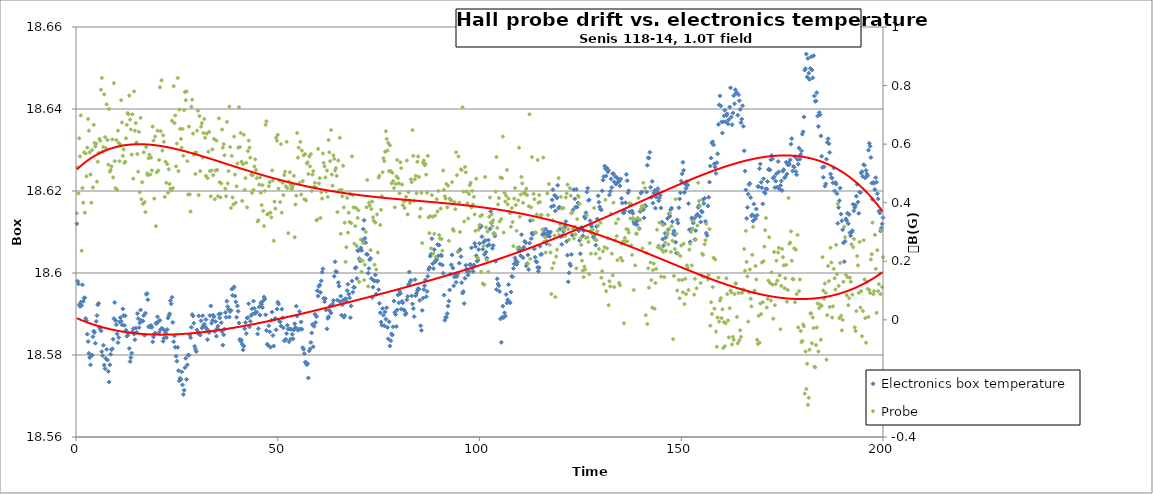
| Category | Electronics box temperature |
|---|---|
| 0.2 | 18.612 |
| 0.4 | 18.598 |
| 0.6000000000000001 | 18.597 |
| 0.8 | 18.592 |
| 1.0 | 18.592 |
| 1.2 | 18.593 |
| 1.4 | 18.592 |
| 1.5999999999999999 | 18.597 |
| 1.7999999999999998 | 18.593 |
| 1.9999999999999998 | 18.594 |
| 2.1999999999999997 | 18.594 |
| 2.4 | 18.589 |
| 2.6 | 18.588 |
| 2.8000000000000003 | 18.585 |
| 3.0000000000000004 | 18.583 |
| 3.2000000000000006 | 18.58 |
| 3.400000000000001 | 18.579 |
| 3.600000000000001 | 18.578 |
| 3.800000000000001 | 18.58 |
| 4.000000000000001 | 18.58 |
| 4.200000000000001 | 18.584 |
| 4.400000000000001 | 18.586 |
| 4.600000000000001 | 18.586 |
| 4.800000000000002 | 18.583 |
| 5.000000000000002 | 18.588 |
| 5.200000000000002 | 18.59 |
| 5.400000000000002 | 18.592 |
| 5.600000000000002 | 18.593 |
| 5.8000000000000025 | 18.587 |
| 6.000000000000003 | 18.586 |
| 6.200000000000003 | 18.586 |
| 6.400000000000003 | 18.581 |
| 6.600000000000003 | 18.58 |
| 6.800000000000003 | 18.582 |
| 7.0000000000000036 | 18.578 |
| 7.200000000000004 | 18.577 |
| 7.400000000000004 | 18.579 |
| 7.600000000000004 | 18.581 |
| 7.800000000000004 | 18.579 |
| 8.000000000000004 | 18.576 |
| 8.200000000000003 | 18.573 |
| 8.400000000000002 | 18.578 |
| 8.600000000000001 | 18.58 |
| 8.8 | 18.581 |
| 9.0 | 18.582 |
| 9.2 | 18.584 |
| 9.399999999999999 | 18.589 |
| 9.599999999999998 | 18.593 |
| 9.799999999999997 | 18.588 |
| 9.999999999999996 | 18.587 |
| 10.199999999999996 | 18.585 |
| 10.399999999999995 | 18.583 |
| 10.599999999999994 | 18.584 |
| 10.799999999999994 | 18.588 |
| 10.999999999999993 | 18.589 |
| 11.199999999999992 | 18.588 |
| 11.399999999999991 | 18.587 |
| 11.59999999999999 | 18.591 |
| 11.79999999999999 | 18.59 |
| 11.99999999999999 | 18.587 |
| 12.199999999999989 | 18.59 |
| 12.399999999999988 | 18.586 |
| 12.599999999999987 | 18.585 |
| 12.799999999999986 | 18.585 |
| 12.999999999999986 | 18.585 |
| 13.199999999999985 | 18.582 |
| 13.399999999999984 | 18.578 |
| 13.599999999999984 | 18.579 |
| 13.799999999999983 | 18.58 |
| 13.999999999999982 | 18.586 |
| 14.199999999999982 | 18.586 |
| 14.39999999999998 | 18.585 |
| 14.59999999999998 | 18.584 |
| 14.79999999999998 | 18.587 |
| 14.999999999999979 | 18.586 |
| 15.199999999999978 | 18.59 |
| 15.399999999999977 | 18.589 |
| 15.599999999999977 | 18.587 |
| 15.799999999999976 | 18.588 |
| 15.999999999999975 | 18.591 |
| 16.199999999999974 | 18.588 |
| 16.399999999999974 | 18.588 |
| 16.599999999999973 | 18.588 |
| 16.799999999999972 | 18.59 |
| 16.99999999999997 | 18.585 |
| 17.19999999999997 | 18.59 |
| 17.39999999999997 | 18.595 |
| 17.59999999999997 | 18.595 |
| 17.79999999999997 | 18.593 |
| 17.999999999999968 | 18.587 |
| 18.199999999999967 | 18.587 |
| 18.399999999999967 | 18.587 |
| 18.599999999999966 | 18.587 |
| 18.799999999999965 | 18.587 |
| 18.999999999999964 | 18.583 |
| 19.199999999999964 | 18.584 |
| 19.399999999999963 | 18.585 |
| 19.599999999999962 | 18.585 |
| 19.79999999999996 | 18.588 |
| 19.99999999999996 | 18.588 |
| 20.19999999999996 | 18.589 |
| 20.39999999999996 | 18.588 |
| 20.59999999999996 | 18.586 |
| 20.799999999999958 | 18.588 |
| 20.999999999999957 | 18.586 |
| 21.199999999999957 | 18.587 |
| 21.399999999999956 | 18.586 |
| 21.599999999999955 | 18.583 |
| 21.799999999999955 | 18.584 |
| 21.999999999999954 | 18.586 |
| 22.199999999999953 | 18.585 |
| 22.399999999999952 | 18.584 |
| 22.59999999999995 | 18.586 |
| 22.79999999999995 | 18.589 |
| 22.99999999999995 | 18.59 |
| 23.19999999999995 | 18.59 |
| 23.39999999999995 | 18.593 |
| 23.599999999999948 | 18.592 |
| 23.799999999999947 | 18.594 |
| 23.999999999999947 | 18.588 |
| 24.199999999999946 | 18.583 |
| 24.399999999999945 | 18.585 |
| 24.599999999999945 | 18.582 |
| 24.799999999999944 | 18.58 |
| 24.999999999999943 | 18.578 |
| 25.199999999999942 | 18.582 |
| 25.39999999999994 | 18.576 |
| 25.59999999999994 | 18.574 |
| 25.79999999999994 | 18.574 |
| 25.99999999999994 | 18.574 |
| 26.19999999999994 | 18.576 |
| 26.399999999999938 | 18.573 |
| 26.599999999999937 | 18.57 |
| 26.799999999999937 | 18.571 |
| 26.999999999999936 | 18.577 |
| 27.199999999999935 | 18.579 |
| 27.399999999999935 | 18.574 |
| 27.599999999999934 | 18.578 |
| 27.799999999999933 | 18.58 |
| 27.999999999999932 | 18.58 |
| 28.199999999999932 | 18.585 |
| 28.39999999999993 | 18.584 |
| 28.59999999999993 | 18.587 |
| 28.79999999999993 | 18.59 |
| 28.99999999999993 | 18.59 |
| 29.19999999999993 | 18.588 |
| 29.399999999999928 | 18.582 |
| 29.599999999999927 | 18.581 |
| 29.799999999999926 | 18.581 |
| 29.999999999999925 | 18.586 |
| 30.199999999999925 | 18.585 |
| 30.399999999999924 | 18.59 |
| 30.599999999999923 | 18.585 |
| 30.799999999999923 | 18.585 |
| 30.999999999999922 | 18.588 |
| 31.19999999999992 | 18.587 |
| 31.39999999999992 | 18.59 |
| 31.59999999999992 | 18.587 |
| 31.79999999999992 | 18.588 |
| 31.99999999999992 | 18.587 |
| 32.19999999999992 | 18.589 |
| 32.39999999999992 | 18.586 |
| 32.59999999999992 | 18.584 |
| 32.799999999999926 | 18.586 |
| 32.99999999999993 | 18.585 |
| 33.19999999999993 | 18.59 |
| 33.399999999999935 | 18.592 |
| 33.59999999999994 | 18.588 |
| 33.79999999999994 | 18.588 |
| 33.99999999999994 | 18.59 |
| 34.199999999999946 | 18.589 |
| 34.39999999999995 | 18.586 |
| 34.59999999999995 | 18.588 |
| 34.799999999999955 | 18.585 |
| 34.99999999999996 | 18.586 |
| 35.19999999999996 | 18.587 |
| 35.39999999999996 | 18.59 |
| 35.599999999999966 | 18.589 |
| 35.79999999999997 | 18.59 |
| 35.99999999999997 | 18.588 |
| 36.199999999999974 | 18.586 |
| 36.39999999999998 | 18.582 |
| 36.59999999999998 | 18.585 |
| 36.79999999999998 | 18.586 |
| 36.999999999999986 | 18.59 |
| 37.19999999999999 | 18.589 |
| 37.39999999999999 | 18.593 |
| 37.599999999999994 | 18.592 |
| 37.8 | 18.591 |
| 38.0 | 18.589 |
| 38.2 | 18.591 |
| 38.400000000000006 | 18.591 |
| 38.60000000000001 | 18.596 |
| 38.80000000000001 | 18.595 |
| 39.000000000000014 | 18.596 |
| 39.20000000000002 | 18.597 |
| 39.40000000000002 | 18.594 |
| 39.60000000000002 | 18.593 |
| 39.800000000000026 | 18.589 |
| 40.00000000000003 | 18.592 |
| 40.20000000000003 | 18.591 |
| 40.400000000000034 | 18.588 |
| 40.60000000000004 | 18.584 |
| 40.80000000000004 | 18.583 |
| 41.00000000000004 | 18.584 |
| 41.200000000000045 | 18.583 |
| 41.40000000000005 | 18.581 |
| 41.60000000000005 | 18.582 |
| 41.800000000000054 | 18.586 |
| 42.00000000000006 | 18.588 |
| 42.20000000000006 | 18.585 |
| 42.40000000000006 | 18.589 |
| 42.600000000000065 | 18.589 |
| 42.80000000000007 | 18.592 |
| 43.00000000000007 | 18.587 |
| 43.200000000000074 | 18.588 |
| 43.40000000000008 | 18.59 |
| 43.60000000000008 | 18.591 |
| 43.80000000000008 | 18.59 |
| 44.000000000000085 | 18.593 |
| 44.20000000000009 | 18.591 |
| 44.40000000000009 | 18.59 |
| 44.600000000000094 | 18.59 |
| 44.8000000000001 | 18.59 |
| 45.0000000000001 | 18.585 |
| 45.2000000000001 | 18.586 |
| 45.400000000000105 | 18.592 |
| 45.60000000000011 | 18.59 |
| 45.80000000000011 | 18.593 |
| 46.000000000000114 | 18.592 |
| 46.20000000000012 | 18.592 |
| 46.40000000000012 | 18.593 |
| 46.60000000000012 | 18.594 |
| 46.800000000000125 | 18.594 |
| 47.00000000000013 | 18.59 |
| 47.20000000000013 | 18.586 |
| 47.400000000000134 | 18.583 |
| 47.600000000000136 | 18.582 |
| 47.80000000000014 | 18.587 |
| 48.00000000000014 | 18.586 |
| 48.200000000000145 | 18.582 |
| 48.40000000000015 | 18.588 |
| 48.60000000000015 | 18.59 |
| 48.80000000000015 | 18.585 |
| 49.000000000000156 | 18.582 |
| 49.20000000000016 | 18.589 |
| 49.40000000000016 | 18.589 |
| 49.600000000000165 | 18.586 |
| 49.80000000000017 | 18.591 |
| 50.00000000000017 | 18.593 |
| 50.20000000000017 | 18.592 |
| 50.400000000000176 | 18.588 |
| 50.60000000000018 | 18.588 |
| 50.80000000000018 | 18.587 |
| 51.000000000000185 | 18.591 |
| 51.20000000000019 | 18.589 |
| 51.40000000000019 | 18.587 |
| 51.60000000000019 | 18.583 |
| 51.800000000000196 | 18.584 |
| 52.0000000000002 | 18.584 |
| 52.2000000000002 | 18.585 |
| 52.400000000000205 | 18.587 |
| 52.60000000000021 | 18.586 |
| 52.80000000000021 | 18.583 |
| 53.00000000000021 | 18.586 |
| 53.200000000000216 | 18.584 |
| 53.40000000000022 | 18.586 |
| 53.60000000000022 | 18.585 |
| 53.800000000000225 | 18.584 |
| 54.00000000000023 | 18.586 |
| 54.20000000000023 | 18.588 |
| 54.40000000000023 | 18.587 |
| 54.600000000000236 | 18.592 |
| 54.80000000000024 | 18.589 |
| 55.00000000000024 | 18.586 |
| 55.200000000000244 | 18.586 |
| 55.40000000000025 | 18.591 |
| 55.60000000000025 | 18.586 |
| 55.80000000000025 | 18.588 |
| 56.000000000000256 | 18.586 |
| 56.20000000000026 | 18.582 |
| 56.40000000000026 | 18.581 |
| 56.600000000000264 | 18.58 |
| 56.80000000000027 | 18.578 |
| 57.00000000000027 | 18.578 |
| 57.20000000000027 | 18.578 |
| 57.400000000000276 | 18.578 |
| 57.60000000000028 | 18.574 |
| 57.80000000000028 | 18.581 |
| 58.000000000000284 | 18.581 |
| 58.20000000000029 | 18.583 |
| 58.40000000000029 | 18.585 |
| 58.60000000000029 | 18.587 |
| 58.800000000000296 | 18.582 |
| 59.0000000000003 | 18.587 |
| 59.2000000000003 | 18.59 |
| 59.400000000000304 | 18.588 |
| 59.60000000000031 | 18.589 |
| 59.80000000000031 | 18.596 |
| 60.00000000000031 | 18.594 |
| 60.200000000000315 | 18.597 |
| 60.40000000000032 | 18.597 |
| 60.60000000000032 | 18.595 |
| 60.800000000000324 | 18.598 |
| 61.00000000000033 | 18.6 |
| 61.20000000000033 | 18.601 |
| 61.40000000000033 | 18.594 |
| 61.600000000000335 | 18.593 |
| 61.80000000000034 | 18.594 |
| 62.00000000000034 | 18.591 |
| 62.200000000000344 | 18.586 |
| 62.40000000000035 | 18.589 |
| 62.60000000000035 | 18.589 |
| 62.80000000000035 | 18.591 |
| 63.000000000000355 | 18.592 |
| 63.20000000000036 | 18.59 |
| 63.40000000000036 | 18.592 |
| 63.600000000000364 | 18.592 |
| 63.80000000000037 | 18.593 |
| 64.00000000000037 | 18.599 |
| 64.20000000000037 | 18.603 |
| 64.40000000000038 | 18.6 |
| 64.60000000000038 | 18.6 |
| 64.80000000000038 | 18.593 |
| 65.00000000000038 | 18.598 |
| 65.20000000000039 | 18.597 |
| 65.40000000000039 | 18.593 |
| 65.60000000000039 | 18.594 |
| 65.8000000000004 | 18.59 |
| 66.0000000000004 | 18.592 |
| 66.2000000000004 | 18.593 |
| 66.4000000000004 | 18.589 |
| 66.6000000000004 | 18.59 |
| 66.80000000000041 | 18.594 |
| 67.00000000000041 | 18.593 |
| 67.20000000000041 | 18.596 |
| 67.40000000000042 | 18.597 |
| 67.60000000000042 | 18.595 |
| 67.80000000000042 | 18.594 |
| 68.00000000000043 | 18.589 |
| 68.20000000000043 | 18.592 |
| 68.40000000000043 | 18.598 |
| 68.60000000000043 | 18.595 |
| 68.80000000000044 | 18.596 |
| 69.00000000000044 | 18.596 |
| 69.20000000000044 | 18.601 |
| 69.40000000000045 | 18.601 |
| 69.60000000000045 | 18.599 |
| 69.80000000000045 | 18.605 |
| 70.00000000000045 | 18.605 |
| 70.20000000000046 | 18.603 |
| 70.40000000000046 | 18.603 |
| 70.60000000000046 | 18.606 |
| 70.80000000000047 | 18.605 |
| 71.00000000000047 | 18.608 |
| 71.20000000000047 | 18.611 |
| 71.40000000000047 | 18.613 |
| 71.60000000000048 | 18.608 |
| 71.80000000000048 | 18.607 |
| 72.00000000000048 | 18.605 |
| 72.20000000000049 | 18.605 |
| 72.40000000000049 | 18.6 |
| 72.60000000000049 | 18.601 |
| 72.8000000000005 | 18.603 |
| 73.0000000000005 | 18.604 |
| 73.2000000000005 | 18.599 |
| 73.4000000000005 | 18.594 |
| 73.6000000000005 | 18.597 |
| 73.80000000000051 | 18.598 |
| 74.00000000000051 | 18.598 |
| 74.20000000000051 | 18.6 |
| 74.40000000000052 | 18.595 |
| 74.60000000000052 | 18.598 |
| 74.80000000000052 | 18.598 |
| 75.00000000000053 | 18.596 |
| 75.20000000000053 | 18.593 |
| 75.40000000000053 | 18.59 |
| 75.60000000000053 | 18.588 |
| 75.80000000000054 | 18.587 |
| 76.00000000000054 | 18.591 |
| 76.20000000000054 | 18.59 |
| 76.40000000000055 | 18.587 |
| 76.60000000000055 | 18.591 |
| 76.80000000000055 | 18.589 |
| 77.00000000000055 | 18.592 |
| 77.20000000000056 | 18.587 |
| 77.40000000000056 | 18.584 |
| 77.60000000000056 | 18.588 |
| 77.80000000000057 | 18.582 |
| 78.00000000000057 | 18.583 |
| 78.20000000000057 | 18.585 |
| 78.40000000000057 | 18.585 |
| 78.60000000000058 | 18.587 |
| 78.80000000000058 | 18.593 |
| 79.00000000000058 | 18.59 |
| 79.20000000000059 | 18.59 |
| 79.40000000000059 | 18.587 |
| 79.60000000000059 | 18.591 |
| 79.8000000000006 | 18.595 |
| 80.0000000000006 | 18.593 |
| 80.2000000000006 | 18.596 |
| 80.4000000000006 | 18.595 |
| 80.6000000000006 | 18.591 |
| 80.80000000000061 | 18.593 |
| 81.00000000000061 | 18.593 |
| 81.20000000000061 | 18.591 |
| 81.40000000000062 | 18.591 |
| 81.60000000000062 | 18.59 |
| 81.80000000000062 | 18.59 |
| 82.00000000000063 | 18.593 |
| 82.20000000000063 | 18.594 |
| 82.40000000000063 | 18.597 |
| 82.60000000000063 | 18.6 |
| 82.80000000000064 | 18.598 |
| 83.00000000000064 | 18.598 |
| 83.20000000000064 | 18.594 |
| 83.40000000000065 | 18.592 |
| 83.60000000000065 | 18.591 |
| 83.80000000000065 | 18.589 |
| 84.00000000000065 | 18.598 |
| 84.20000000000066 | 18.594 |
| 84.40000000000066 | 18.595 |
| 84.60000000000066 | 18.596 |
| 84.80000000000067 | 18.596 |
| 85.00000000000067 | 18.596 |
| 85.20000000000067 | 18.593 |
| 85.40000000000067 | 18.587 |
| 85.60000000000068 | 18.586 |
| 85.80000000000068 | 18.591 |
| 86.00000000000068 | 18.594 |
| 86.20000000000068 | 18.596 |
| 86.40000000000069 | 18.597 |
| 86.60000000000069 | 18.598 |
| 86.8000000000007 | 18.594 |
| 87.0000000000007 | 18.595 |
| 87.2000000000007 | 18.599 |
| 87.4000000000007 | 18.601 |
| 87.6000000000007 | 18.601 |
| 87.80000000000071 | 18.604 |
| 88.00000000000071 | 18.605 |
| 88.20000000000071 | 18.608 |
| 88.40000000000072 | 18.602 |
| 88.60000000000072 | 18.601 |
| 88.80000000000072 | 18.606 |
| 89.00000000000072 | 18.603 |
| 89.20000000000073 | 18.603 |
| 89.40000000000073 | 18.603 |
| 89.60000000000073 | 18.607 |
| 89.80000000000074 | 18.604 |
| 90.00000000000074 | 18.607 |
| 90.20000000000074 | 18.602 |
| 90.40000000000074 | 18.604 |
| 90.60000000000075 | 18.604 |
| 90.80000000000075 | 18.602 |
| 91.00000000000075 | 18.6 |
| 91.20000000000076 | 18.595 |
| 91.40000000000076 | 18.588 |
| 91.60000000000076 | 18.589 |
| 91.80000000000076 | 18.589 |
| 92.00000000000077 | 18.59 |
| 92.20000000000077 | 18.592 |
| 92.40000000000077 | 18.593 |
| 92.60000000000078 | 18.596 |
| 92.80000000000078 | 18.6 |
| 93.00000000000078 | 18.602 |
| 93.20000000000078 | 18.604 |
| 93.40000000000079 | 18.601 |
| 93.60000000000079 | 18.597 |
| 93.8000000000008 | 18.599 |
| 94.0000000000008 | 18.6 |
| 94.2000000000008 | 18.598 |
| 94.4000000000008 | 18.599 |
| 94.6000000000008 | 18.6 |
| 94.80000000000081 | 18.605 |
| 95.00000000000081 | 18.602 |
| 95.20000000000081 | 18.606 |
| 95.40000000000082 | 18.604 |
| 95.60000000000082 | 18.598 |
| 95.80000000000082 | 18.595 |
| 96.00000000000082 | 18.595 |
| 96.20000000000083 | 18.593 |
| 96.40000000000083 | 18.599 |
| 96.60000000000083 | 18.602 |
| 96.80000000000084 | 18.601 |
| 97.00000000000084 | 18.6 |
| 97.20000000000084 | 18.6 |
| 97.40000000000084 | 18.6 |
| 97.60000000000085 | 18.602 |
| 97.80000000000085 | 18.602 |
| 98.00000000000085 | 18.606 |
| 98.20000000000086 | 18.601 |
| 98.40000000000086 | 18.6 |
| 98.60000000000086 | 18.602 |
| 98.80000000000086 | 18.607 |
| 99.00000000000087 | 18.606 |
| 99.20000000000087 | 18.604 |
| 99.40000000000087 | 18.603 |
| 99.60000000000088 | 18.603 |
| 99.80000000000088 | 18.606 |
| 100.00000000000088 | 18.607 |
| 100.20000000000088 | 18.611 |
| 100.40000000000089 | 18.612 |
| 100.60000000000089 | 18.609 |
| 100.80000000000089 | 18.606 |
| 101.0000000000009 | 18.608 |
| 101.2000000000009 | 18.605 |
| 101.4000000000009 | 18.608 |
| 101.6000000000009 | 18.605 |
| 101.8000000000009 | 18.604 |
| 102.00000000000091 | 18.607 |
| 102.20000000000091 | 18.608 |
| 102.40000000000092 | 18.607 |
| 102.60000000000092 | 18.611 |
| 102.80000000000092 | 18.615 |
| 103.00000000000092 | 18.612 |
| 103.20000000000093 | 18.606 |
| 103.40000000000093 | 18.607 |
| 103.60000000000093 | 18.61 |
| 103.80000000000094 | 18.609 |
| 104.00000000000094 | 18.603 |
| 104.20000000000094 | 18.596 |
| 104.40000000000094 | 18.599 |
| 104.60000000000095 | 18.597 |
| 104.80000000000095 | 18.597 |
| 105.00000000000095 | 18.595 |
| 105.20000000000095 | 18.589 |
| 105.40000000000096 | 18.583 |
| 105.60000000000096 | 18.589 |
| 105.80000000000096 | 18.592 |
| 106.00000000000097 | 18.589 |
| 106.20000000000097 | 18.59 |
| 106.40000000000097 | 18.59 |
| 106.60000000000097 | 18.595 |
| 106.80000000000098 | 18.593 |
| 107.00000000000098 | 18.593 |
| 107.20000000000098 | 18.597 |
| 107.40000000000099 | 18.593 |
| 107.60000000000099 | 18.593 |
| 107.80000000000099 | 18.595 |
| 108.000000000001 | 18.599 |
| 108.200000000001 | 18.599 |
| 108.400000000001 | 18.601 |
| 108.600000000001 | 18.602 |
| 108.800000000001 | 18.604 |
| 109.00000000000101 | 18.603 |
| 109.20000000000101 | 18.602 |
| 109.40000000000101 | 18.603 |
| 109.60000000000102 | 18.606 |
| 109.80000000000102 | 18.606 |
| 110.00000000000102 | 18.605 |
| 110.20000000000103 | 18.604 |
| 110.40000000000103 | 18.609 |
| 110.60000000000103 | 18.606 |
| 110.80000000000103 | 18.604 |
| 111.00000000000104 | 18.606 |
| 111.20000000000104 | 18.608 |
| 111.40000000000104 | 18.607 |
| 111.60000000000105 | 18.602 |
| 111.80000000000105 | 18.602 |
| 112.00000000000105 | 18.604 |
| 112.20000000000105 | 18.601 |
| 112.40000000000106 | 18.607 |
| 112.60000000000106 | 18.613 |
| 112.80000000000106 | 18.608 |
| 113.00000000000107 | 18.61 |
| 113.20000000000107 | 18.609 |
| 113.40000000000107 | 18.61 |
| 113.60000000000107 | 18.606 |
| 113.80000000000108 | 18.604 |
| 114.00000000000108 | 18.603 |
| 114.20000000000108 | 18.603 |
| 114.40000000000109 | 18.601 |
| 114.60000000000109 | 18.6 |
| 114.80000000000109 | 18.601 |
| 115.0000000000011 | 18.607 |
| 115.2000000000011 | 18.604 |
| 115.4000000000011 | 18.605 |
| 115.6000000000011 | 18.609 |
| 115.8000000000011 | 18.611 |
| 116.00000000000111 | 18.61 |
| 116.20000000000111 | 18.61 |
| 116.40000000000111 | 18.611 |
| 116.60000000000112 | 18.607 |
| 116.80000000000112 | 18.609 |
| 117.00000000000112 | 18.61 |
| 117.20000000000113 | 18.61 |
| 117.40000000000113 | 18.609 |
| 117.60000000000113 | 18.61 |
| 117.80000000000113 | 18.616 |
| 118.00000000000114 | 18.618 |
| 118.20000000000114 | 18.62 |
| 118.40000000000114 | 18.616 |
| 118.60000000000115 | 18.619 |
| 118.80000000000115 | 18.615 |
| 119.00000000000115 | 18.619 |
| 119.20000000000115 | 18.618 |
| 119.40000000000116 | 18.621 |
| 119.60000000000116 | 18.616 |
| 119.80000000000116 | 18.616 |
| 120.00000000000117 | 18.611 |
| 120.20000000000117 | 18.609 |
| 120.40000000000117 | 18.607 |
| 120.60000000000117 | 18.609 |
| 120.80000000000118 | 18.61 |
| 121.00000000000118 | 18.611 |
| 121.20000000000118 | 18.611 |
| 121.40000000000119 | 18.613 |
| 121.60000000000119 | 18.608 |
| 121.80000000000119 | 18.604 |
| 122.0000000000012 | 18.598 |
| 122.2000000000012 | 18.6 |
| 122.4000000000012 | 18.602 |
| 122.6000000000012 | 18.602 |
| 122.8000000000012 | 18.605 |
| 123.00000000000121 | 18.609 |
| 123.20000000000121 | 18.615 |
| 123.40000000000121 | 18.62 |
| 123.60000000000122 | 18.618 |
| 123.80000000000122 | 18.616 |
| 124.00000000000122 | 18.62 |
| 124.20000000000122 | 18.616 |
| 124.40000000000123 | 18.617 |
| 124.60000000000123 | 18.61 |
| 124.80000000000123 | 18.608 |
| 125.00000000000124 | 18.605 |
| 125.20000000000124 | 18.611 |
| 125.40000000000124 | 18.611 |
| 125.60000000000124 | 18.609 |
| 125.80000000000125 | 18.61 |
| 126.00000000000125 | 18.614 |
| 126.20000000000125 | 18.613 |
| 126.40000000000126 | 18.615 |
| 126.60000000000126 | 18.62 |
| 126.80000000000126 | 18.621 |
| 127.00000000000126 | 18.618 |
| 127.20000000000127 | 18.618 |
| 127.40000000000127 | 18.613 |
| 127.60000000000127 | 18.612 |
| 127.80000000000128 | 18.611 |
| 128.00000000000128 | 18.61 |
| 128.20000000000127 | 18.609 |
| 128.40000000000126 | 18.609 |
| 128.60000000000124 | 18.608 |
| 128.80000000000123 | 18.607 |
| 129.00000000000122 | 18.611 |
| 129.2000000000012 | 18.613 |
| 129.4000000000012 | 18.619 |
| 129.6000000000012 | 18.617 |
| 129.80000000000118 | 18.616 |
| 130.00000000000117 | 18.616 |
| 130.20000000000115 | 18.615 |
| 130.40000000000114 | 18.62 |
| 130.60000000000113 | 18.623 |
| 130.80000000000112 | 18.624 |
| 131.0000000000011 | 18.626 |
| 131.2000000000011 | 18.625 |
| 131.40000000000109 | 18.624 |
| 131.60000000000107 | 18.626 |
| 131.80000000000106 | 18.625 |
| 132.00000000000105 | 18.625 |
| 132.20000000000104 | 18.619 |
| 132.40000000000103 | 18.62 |
| 132.60000000000102 | 18.623 |
| 132.800000000001 | 18.621 |
| 133.000000000001 | 18.624 |
| 133.20000000000098 | 18.624 |
| 133.40000000000097 | 18.622 |
| 133.60000000000096 | 18.624 |
| 133.80000000000095 | 18.622 |
| 134.00000000000094 | 18.623 |
| 134.20000000000093 | 18.622 |
| 134.40000000000092 | 18.623 |
| 134.6000000000009 | 18.622 |
| 134.8000000000009 | 18.621 |
| 135.00000000000088 | 18.623 |
| 135.20000000000087 | 18.618 |
| 135.40000000000086 | 18.617 |
| 135.60000000000085 | 18.615 |
| 135.80000000000084 | 18.615 |
| 136.00000000000082 | 18.615 |
| 136.2000000000008 | 18.617 |
| 136.4000000000008 | 18.624 |
| 136.6000000000008 | 18.623 |
| 136.80000000000078 | 18.62 |
| 137.00000000000077 | 18.62 |
| 137.20000000000076 | 18.615 |
| 137.40000000000074 | 18.617 |
| 137.60000000000073 | 18.617 |
| 137.80000000000072 | 18.615 |
| 138.0000000000007 | 18.615 |
| 138.2000000000007 | 18.612 |
| 138.4000000000007 | 18.612 |
| 138.60000000000068 | 18.613 |
| 138.80000000000067 | 18.612 |
| 139.00000000000065 | 18.612 |
| 139.20000000000064 | 18.613 |
| 139.40000000000063 | 18.613 |
| 139.60000000000062 | 18.611 |
| 139.8000000000006 | 18.615 |
| 140.0000000000006 | 18.619 |
| 140.20000000000059 | 18.62 |
| 140.40000000000057 | 18.616 |
| 140.60000000000056 | 18.615 |
| 140.80000000000055 | 18.613 |
| 141.00000000000054 | 18.616 |
| 141.20000000000053 | 18.616 |
| 141.40000000000052 | 18.62 |
| 141.6000000000005 | 18.626 |
| 141.8000000000005 | 18.628 |
| 142.00000000000048 | 18.628 |
| 142.20000000000047 | 18.629 |
| 142.40000000000046 | 18.621 |
| 142.60000000000045 | 18.618 |
| 142.80000000000044 | 18.622 |
| 143.00000000000043 | 18.617 |
| 143.20000000000041 | 18.619 |
| 143.4000000000004 | 18.62 |
| 143.6000000000004 | 18.616 |
| 143.80000000000038 | 18.619 |
| 144.00000000000037 | 18.62 |
| 144.20000000000036 | 18.621 |
| 144.40000000000035 | 18.618 |
| 144.60000000000034 | 18.618 |
| 144.80000000000032 | 18.619 |
| 145.0000000000003 | 18.616 |
| 145.2000000000003 | 18.612 |
| 145.4000000000003 | 18.608 |
| 145.60000000000028 | 18.607 |
| 145.80000000000027 | 18.612 |
| 146.00000000000026 | 18.61 |
| 146.20000000000024 | 18.609 |
| 146.40000000000023 | 18.609 |
| 146.60000000000022 | 18.613 |
| 146.8000000000002 | 18.611 |
| 147.0000000000002 | 18.614 |
| 147.2000000000002 | 18.614 |
| 147.40000000000018 | 18.615 |
| 147.60000000000016 | 18.616 |
| 147.80000000000015 | 18.612 |
| 148.00000000000014 | 18.61 |
| 148.20000000000013 | 18.61 |
| 148.40000000000012 | 18.609 |
| 148.6000000000001 | 18.608 |
| 148.8000000000001 | 18.605 |
| 149.00000000000009 | 18.613 |
| 149.20000000000007 | 18.612 |
| 149.40000000000006 | 18.616 |
| 149.60000000000005 | 18.618 |
| 149.80000000000004 | 18.62 |
| 150.00000000000003 | 18.622 |
| 150.20000000000002 | 18.624 |
| 150.4 | 18.627 |
| 150.6 | 18.625 |
| 150.79999999999998 | 18.62 |
| 150.99999999999997 | 18.622 |
| 151.19999999999996 | 18.621 |
| 151.39999999999995 | 18.622 |
| 151.59999999999994 | 18.621 |
| 151.79999999999993 | 18.617 |
| 151.99999999999991 | 18.611 |
| 152.1999999999999 | 18.608 |
| 152.3999999999999 | 18.611 |
| 152.59999999999988 | 18.613 |
| 152.79999999999987 | 18.613 |
| 152.99999999999986 | 18.612 |
| 153.19999999999985 | 18.613 |
| 153.39999999999984 | 18.608 |
| 153.59999999999982 | 18.61 |
| 153.7999999999998 | 18.614 |
| 153.9999999999998 | 18.614 |
| 154.1999999999998 | 18.616 |
| 154.39999999999978 | 18.616 |
| 154.59999999999977 | 18.614 |
| 154.79999999999976 | 18.612 |
| 154.99999999999974 | 18.615 |
| 155.19999999999973 | 18.615 |
| 155.39999999999972 | 18.618 |
| 155.5999999999997 | 18.617 |
| 155.7999999999997 | 18.618 |
| 155.9999999999997 | 18.613 |
| 156.19999999999968 | 18.61 |
| 156.39999999999966 | 18.609 |
| 156.59999999999965 | 18.616 |
| 156.79999999999964 | 18.618 |
| 156.99999999999963 | 18.622 |
| 157.19999999999962 | 18.626 |
| 157.3999999999996 | 18.628 |
| 157.5999999999996 | 18.632 |
| 157.79999999999959 | 18.632 |
| 157.99999999999957 | 18.631 |
| 158.19999999999956 | 18.627 |
| 158.39999999999955 | 18.626 |
| 158.59999999999954 | 18.624 |
| 158.79999999999953 | 18.627 |
| 158.99999999999952 | 18.629 |
| 159.1999999999995 | 18.636 |
| 159.3999999999995 | 18.641 |
| 159.59999999999948 | 18.643 |
| 159.79999999999947 | 18.641 |
| 159.99999999999946 | 18.637 |
| 160.19999999999945 | 18.634 |
| 160.39999999999944 | 18.637 |
| 160.59999999999943 | 18.638 |
| 160.79999999999941 | 18.64 |
| 160.9999999999994 | 18.637 |
| 161.1999999999994 | 18.638 |
| 161.39999999999938 | 18.639 |
| 161.59999999999937 | 18.636 |
| 161.79999999999936 | 18.637 |
| 161.99999999999935 | 18.64 |
| 162.19999999999933 | 18.645 |
| 162.39999999999932 | 18.638 |
| 162.5999999999993 | 18.636 |
| 162.7999999999993 | 18.639 |
| 162.9999999999993 | 18.643 |
| 163.19999999999928 | 18.641 |
| 163.39999999999927 | 18.645 |
| 163.59999999999926 | 18.644 |
| 163.79999999999924 | 18.644 |
| 163.99999999999923 | 18.638 |
| 164.19999999999922 | 18.643 |
| 164.3999999999992 | 18.642 |
| 164.5999999999992 | 18.64 |
| 164.7999999999992 | 18.637 |
| 164.99999999999918 | 18.638 |
| 165.19999999999916 | 18.641 |
| 165.39999999999915 | 18.636 |
| 165.59999999999914 | 18.63 |
| 165.79999999999913 | 18.625 |
| 165.99999999999912 | 18.62 |
| 166.1999999999991 | 18.613 |
| 166.3999999999991 | 18.616 |
| 166.59999999999908 | 18.619 |
| 166.79999999999907 | 18.622 |
| 166.99999999999906 | 18.622 |
| 167.19999999999905 | 18.618 |
| 167.39999999999904 | 18.614 |
| 167.59999999999903 | 18.614 |
| 167.79999999999902 | 18.613 |
| 167.999999999999 | 18.617 |
| 168.199999999999 | 18.614 |
| 168.39999999999898 | 18.613 |
| 168.59999999999897 | 18.616 |
| 168.79999999999896 | 18.614 |
| 168.99999999999895 | 18.621 |
| 169.19999999999894 | 18.621 |
| 169.39999999999893 | 18.625 |
| 169.59999999999891 | 18.627 |
| 169.7999999999989 | 18.622 |
| 169.9999999999989 | 18.621 |
| 170.19999999999888 | 18.617 |
| 170.39999999999887 | 18.623 |
| 170.59999999999886 | 18.62 |
| 170.79999999999885 | 18.619 |
| 170.99999999999883 | 18.621 |
| 171.19999999999882 | 18.62 |
| 171.3999999999988 | 18.622 |
| 171.5999999999988 | 18.625 |
| 171.7999999999988 | 18.625 |
| 171.99999999999878 | 18.625 |
| 172.19999999999877 | 18.628 |
| 172.39999999999876 | 18.629 |
| 172.59999999999874 | 18.628 |
| 172.79999999999873 | 18.623 |
| 172.99999999999872 | 18.623 |
| 173.1999999999987 | 18.621 |
| 173.3999999999987 | 18.622 |
| 173.5999999999987 | 18.624 |
| 173.79999999999868 | 18.621 |
| 173.99999999999866 | 18.627 |
| 174.19999999999865 | 18.625 |
| 174.39999999999864 | 18.62 |
| 174.59999999999863 | 18.621 |
| 174.79999999999862 | 18.622 |
| 174.9999999999986 | 18.62 |
| 175.1999999999986 | 18.625 |
| 175.39999999999858 | 18.625 |
| 175.59999999999857 | 18.623 |
| 175.79999999999856 | 18.623 |
| 175.99999999999855 | 18.627 |
| 176.19999999999854 | 18.624 |
| 176.39999999999853 | 18.626 |
| 176.59999999999852 | 18.627 |
| 176.7999999999985 | 18.626 |
| 176.9999999999985 | 18.628 |
| 177.19999999999848 | 18.631 |
| 177.39999999999847 | 18.633 |
| 177.59999999999846 | 18.625 |
| 177.79999999999845 | 18.626 |
| 177.99999999999844 | 18.626 |
| 178.19999999999843 | 18.628 |
| 178.3999999999984 | 18.625 |
| 178.5999999999984 | 18.624 |
| 178.7999999999984 | 18.628 |
| 178.99999999999838 | 18.627 |
| 179.19999999999837 | 18.63 |
| 179.39999999999836 | 18.628 |
| 179.59999999999835 | 18.629 |
| 179.79999999999833 | 18.63 |
| 179.99999999999832 | 18.634 |
| 180.1999999999983 | 18.634 |
| 180.3999999999983 | 18.638 |
| 180.5999999999983 | 18.649 |
| 180.79999999999828 | 18.65 |
| 180.99999999999827 | 18.653 |
| 181.19999999999825 | 18.648 |
| 181.39999999999824 | 18.652 |
| 181.59999999999823 | 18.649 |
| 181.79999999999822 | 18.647 |
| 181.9999999999982 | 18.65 |
| 182.1999999999982 | 18.653 |
| 182.3999999999982 | 18.65 |
| 182.59999999999818 | 18.648 |
| 182.79999999999816 | 18.653 |
| 182.99999999999815 | 18.643 |
| 183.19999999999814 | 18.642 |
| 183.39999999999813 | 18.642 |
| 183.59999999999812 | 18.644 |
| 183.7999999999981 | 18.638 |
| 183.9999999999981 | 18.636 |
| 184.19999999999808 | 18.639 |
| 184.39999999999807 | 18.639 |
| 184.59999999999806 | 18.633 |
| 184.79999999999805 | 18.628 |
| 184.99999999999804 | 18.626 |
| 185.19999999999803 | 18.623 |
| 185.39999999999802 | 18.626 |
| 185.599999999998 | 18.621 |
| 185.799999999998 | 18.622 |
| 185.99999999999798 | 18.628 |
| 186.19999999999797 | 18.632 |
| 186.39999999999796 | 18.633 |
| 186.59999999999795 | 18.632 |
| 186.79999999999794 | 18.629 |
| 186.99999999999793 | 18.624 |
| 187.1999999999979 | 18.623 |
| 187.3999999999979 | 18.623 |
| 187.5999999999979 | 18.622 |
| 187.79999999999788 | 18.626 |
| 187.99999999999787 | 18.62 |
| 188.19999999999786 | 18.622 |
| 188.39999999999785 | 18.622 |
| 188.59999999999783 | 18.619 |
| 188.79999999999782 | 18.612 |
| 188.9999999999978 | 18.616 |
| 189.1999999999978 | 18.618 |
| 189.3999999999978 | 18.621 |
| 189.59999999999778 | 18.614 |
| 189.79999999999777 | 18.613 |
| 189.99999999999775 | 18.611 |
| 190.19999999999774 | 18.607 |
| 190.39999999999773 | 18.603 |
| 190.59999999999772 | 18.608 |
| 190.7999999999977 | 18.613 |
| 190.9999999999977 | 18.613 |
| 191.1999999999977 | 18.615 |
| 191.39999999999768 | 18.612 |
| 191.59999999999766 | 18.614 |
| 191.79999999999765 | 18.61 |
| 191.99999999999764 | 18.609 |
| 192.19999999999763 | 18.61 |
| 192.39999999999762 | 18.61 |
| 192.5999999999976 | 18.617 |
| 192.7999999999976 | 18.615 |
| 192.99999999999758 | 18.616 |
| 193.19999999999757 | 18.617 |
| 193.39999999999756 | 18.619 |
| 193.59999999999755 | 18.622 |
| 193.79999999999754 | 18.617 |
| 193.99999999999753 | 18.615 |
| 194.19999999999752 | 18.62 |
| 194.3999999999975 | 18.62 |
| 194.5999999999975 | 18.624 |
| 194.79999999999748 | 18.625 |
| 194.99999999999747 | 18.624 |
| 195.19999999999746 | 18.626 |
| 195.39999999999745 | 18.626 |
| 195.59999999999744 | 18.623 |
| 195.79999999999742 | 18.625 |
| 195.9999999999974 | 18.624 |
| 196.1999999999974 | 18.624 |
| 196.3999999999974 | 18.63 |
| 196.59999999999738 | 18.632 |
| 196.79999999999737 | 18.631 |
| 196.99999999999736 | 18.628 |
| 197.19999999999735 | 18.622 |
| 197.39999999999733 | 18.618 |
| 197.59999999999732 | 18.622 |
| 197.7999999999973 | 18.622 |
| 197.9999999999973 | 18.62 |
| 198.1999999999973 | 18.623 |
| 198.39999999999728 | 18.622 |
| 198.59999999999727 | 18.619 |
| 198.79999999999725 | 18.618 |
| 198.99999999999724 | 18.615 |
| 199.19999999999723 | 18.615 |
| 199.39999999999722 | 18.61 |
| 199.5999999999972 | 18.611 |
| 199.7999999999972 | 18.612 |
| 199.9999999999972 | 18.614 |